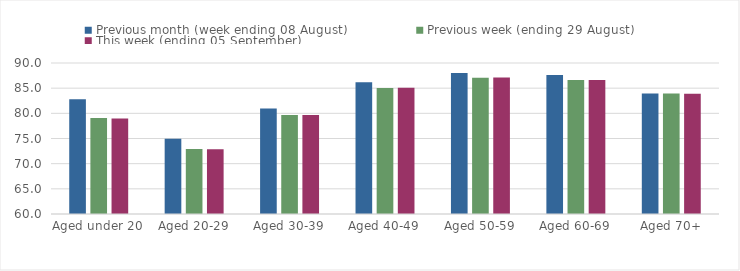
| Category | Previous month (week ending 08 August) | Previous week (ending 29 August) | This week (ending 05 September) |
|---|---|---|---|
| Aged under 20 | 82.82 | 79.07 | 78.96 |
| Aged 20-29 | 74.94 | 72.91 | 72.88 |
| Aged 30-39 | 80.94 | 79.67 | 79.65 |
| Aged 40-49 | 86.2 | 85.04 | 85.06 |
| Aged 50-59 | 88.03 | 87.07 | 87.11 |
| Aged 60-69 | 87.6 | 86.63 | 86.62 |
| Aged 70+ | 83.94 | 83.94 | 83.9 |